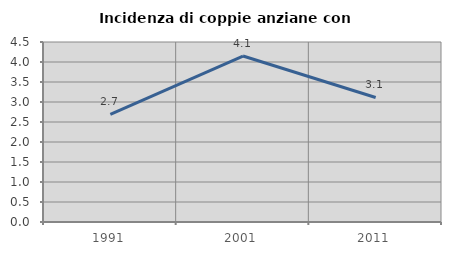
| Category | Incidenza di coppie anziane con figli |
|---|---|
| 1991.0 | 2.692 |
| 2001.0 | 4.149 |
| 2011.0 | 3.113 |